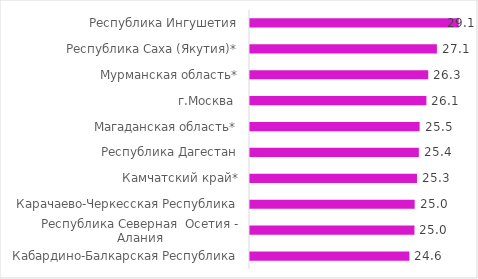
| Category | Проживут  женщины после возраста 55 , лет  |
|---|---|
| Кабардино-Балкарская Республика | 24.56 |
| Республика Северная  Осетия - Алания | 25.02 |
| Карачаево-Черкесская Республика | 25.04 |
| Камчатский край* | 25.25 |
| Республика Дагестан | 25.42 |
| Магаданская область* | 25.49 |
| г.Москва  | 26.11 |
| Мурманская область* | 26.28 |
| Республика Саха (Якутия)* | 27.07 |
| Республика Ингушетия | 29.06 |